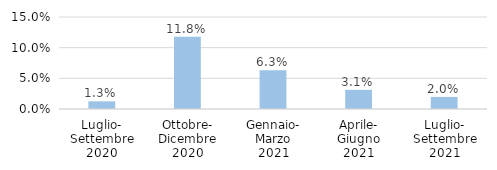
| Category | Italia |
|---|---|
| Luglio-
Settembre
2020 | 0.013 |
| Ottobre-
Dicembre
2020 | 0.118 |
| Gennaio-
Marzo
2021 | 0.063 |
| Aprile-
Giugno
2021 | 0.031 |
| Luglio-
Settembre
2021 | 0.02 |